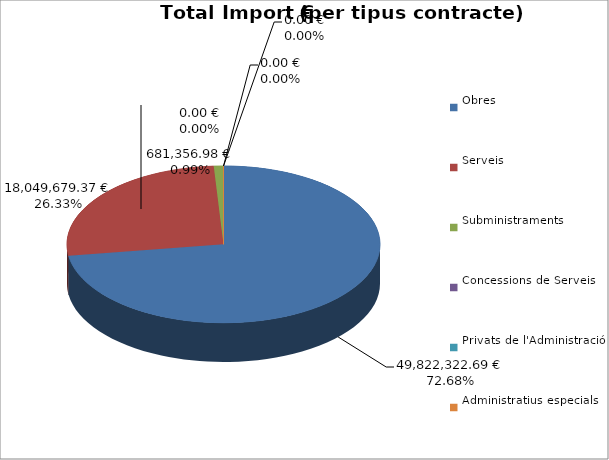
| Category | Total preu
(amb IVA) |
|---|---|
| Obres | 49822322.689 |
| Serveis | 18049679.368 |
| Subministraments | 681356.98 |
| Concessions de Serveis | 0 |
| Privats de l'Administració | 0 |
| Administratius especials | 0 |